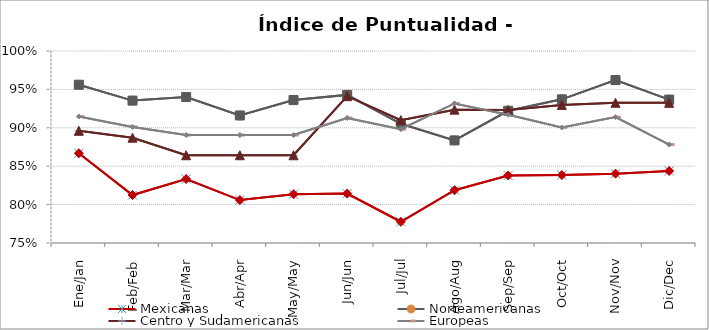
| Category | Mexicanas | Norteamericanas | Centro y Sudamericanas | Europeas |
|---|---|---|---|---|
| Ene/Jan | 0.867 | 0.956 | 0.896 | 0.915 |
| Feb/Feb | 0.812 | 0.935 | 0.887 | 0.901 |
| Mar/Mar | 0.833 | 0.94 | 0.864 | 0.891 |
| Abr/Apr | 0.806 | 0.916 | 0.864 | 0.891 |
| May/May | 0.813 | 0.936 | 0.864 | 0.891 |
| Jun/Jun | 0.814 | 0.943 | 0.941 | 0.913 |
| Jul/Jul | 0.778 | 0.905 | 0.91 | 0.898 |
| Ago/Aug | 0.819 | 0.884 | 0.924 | 0.932 |
| Sep/Sep | 0.838 | 0.922 | 0.923 | 0.917 |
| Oct/Oct | 0.838 | 0.937 | 0.93 | 0.9 |
| Nov/Nov | 0.84 | 0.962 | 0.933 | 0.914 |
| Dic/Dec | 0.844 | 0.937 | 0.933 | 0.878 |